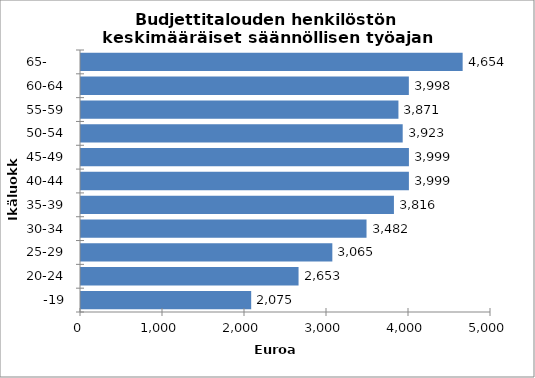
| Category | yhteensä |
|---|---|
| -19 | 2075.485 |
| 20-24 | 2653.136 |
| 25-29 | 3065.136 |
| 30-34 | 3481.995 |
| 35-39 | 3816.228 |
| 40-44 | 3998.857 |
| 45-49 | 3999.084 |
| 50-54 | 3923.176 |
| 55-59 | 3871.189 |
| 60-64 | 3998.176 |
| 65-     | 4654.281 |